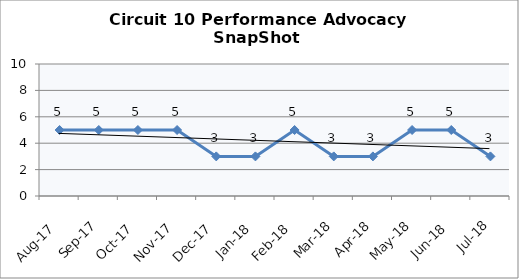
| Category | Circuit 10 |
|---|---|
| Aug-17 | 5 |
| Sep-17 | 5 |
| Oct-17 | 5 |
| Nov-17 | 5 |
| Dec-17 | 3 |
| Jan-18 | 3 |
| Feb-18 | 5 |
| Mar-18 | 3 |
| Apr-18 | 3 |
| May-18 | 5 |
| Jun-18 | 5 |
| Jul-18 | 3 |